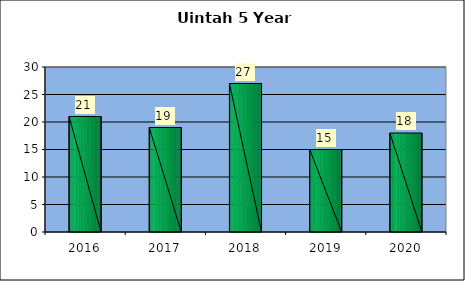
| Category | Washington Terrace March 5 Year Comparison |
|---|---|
| 0 | 21 |
| 1 | 19 |
| 2 | 27 |
| 3 | 15 |
| 4 | 18 |